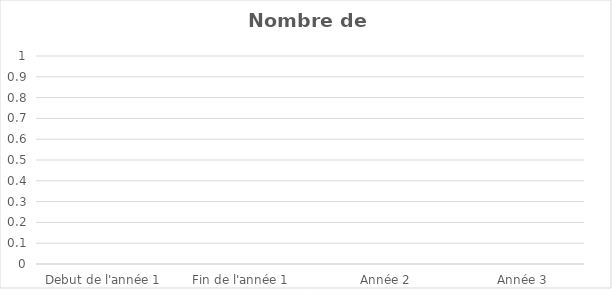
| Category | Nombre de salariés |
|---|---|
| Debut de l'année 1 | 0 |
| Fin de l'année 1 | 0 |
|     Année 2 | 0 |
|     Année 3 | 0 |